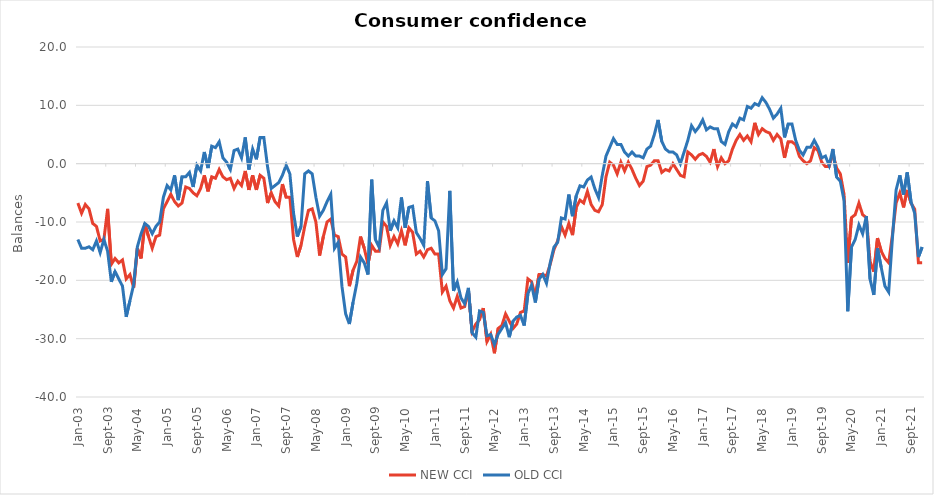
| Category | NEW CCI | OLD CCI |
|---|---|---|
| 2003-01-01 | -6.75 | -13 |
| 2003-02-01 | -8.5 | -14.5 |
| 2003-03-01 | -7 | -14.5 |
| 2003-04-01 | -7.75 | -14.25 |
| 2003-05-01 | -10.25 | -14.75 |
| 2003-06-01 | -10.75 | -13.25 |
| 2003-07-01 | -13.25 | -15.25 |
| 2003-08-01 | -13 | -13 |
| 2003-09-01 | -7.75 | -15 |
| 2003-10-01 | -17.25 | -20.25 |
| 2003-11-01 | -16.25 | -18.5 |
| 2003-12-01 | -17 | -19.75 |
| 2004-01-01 | -16.5 | -21 |
| 2004-02-01 | -19.75 | -26.25 |
| 2004-03-01 | -19 | -23.5 |
| 2004-04-01 | -21.25 | -20.75 |
| 2004-05-01 | -14.5 | -14.25 |
| 2004-06-01 | -16.25 | -12 |
| 2004-07-01 | -10.25 | -10.25 |
| 2004-08-01 | -12.5 | -10.75 |
| 2004-09-01 | -14.5 | -12 |
| 2004-10-01 | -12.5 | -10.75 |
| 2004-11-01 | -12.25 | -10 |
| 2004-12-01 | -7.75 | -5.75 |
| 2005-01-01 | -6.5 | -3.75 |
| 2005-02-01 | -5.25 | -4.5 |
| 2005-03-01 | -6.5 | -2 |
| 2005-04-01 | -7.25 | -6.25 |
| 2005-05-01 | -6.75 | -2.25 |
| 2005-06-01 | -4 | -2.25 |
| 2005-07-01 | -4.25 | -1.5 |
| 2005-08-01 | -5 | -4 |
| 2005-09-01 | -5.5 | -0.25 |
| 2005-10-01 | -4.25 | -1.25 |
| 2005-11-01 | -2 | 2 |
| 2005-12-01 | -4.75 | -0.75 |
| 2006-01-01 | -2.25 | 3 |
| 2006-02-01 | -2.5 | 2.75 |
| 2006-03-01 | -1 | 3.75 |
| 2006-04-01 | -2.25 | 1 |
| 2006-05-01 | -2.75 | 0.25 |
| 2006-06-01 | -2.5 | -1 |
| 2006-07-01 | -4.25 | 2.25 |
| 2006-08-01 | -3 | 2.5 |
| 2006-09-01 | -3.75 | 1 |
| 2006-10-01 | -1.25 | 4.5 |
| 2006-11-01 | -4.5 | -1 |
| 2006-12-01 | -2 | 2.5 |
| 2007-01-01 | -4.5 | 0.75 |
| 2007-02-01 | -2 | 4.5 |
| 2007-03-01 | -2.5 | 4.5 |
| 2007-04-01 | -6.75 | -0.5 |
| 2007-05-01 | -5 | -4.25 |
| 2007-06-01 | -6.5 | -3.75 |
| 2007-07-01 | -7.25 | -3.25 |
| 2007-08-01 | -3.5 | -2 |
| 2007-09-01 | -5.75 | -0.25 |
| 2007-10-01 | -5.75 | -1.75 |
| 2007-11-01 | -13 | -8.5 |
| 2007-12-01 | -16 | -12.5 |
| 2008-01-01 | -14 | -10.75 |
| 2008-02-01 | -10.75 | -1.75 |
| 2008-03-01 | -8 | -1.25 |
| 2008-04-01 | -7.75 | -1.75 |
| 2008-05-01 | -10 | -5.75 |
| 2008-06-01 | -15.75 | -9 |
| 2008-07-01 | -12.5 | -8 |
| 2008-08-01 | -10 | -6.5 |
| 2008-09-01 | -9.5 | -5.25 |
| 2008-10-01 | -12.25 | -14.5 |
| 2008-11-01 | -12.5 | -13.5 |
| 2008-12-01 | -15.5 | -21 |
| 2009-01-01 | -16 | -25.75 |
| 2009-02-01 | -21 | -27.5 |
| 2009-03-01 | -18.25 | -23.75 |
| 2009-04-01 | -16.75 | -20.5 |
| 2009-05-01 | -12.5 | -16 |
| 2009-06-01 | -14.5 | -17 |
| 2009-07-01 | -17.25 | -19 |
| 2009-08-01 | -14 | -2.75 |
| 2009-09-01 | -15 | -13 |
| 2009-10-01 | -15 | -14.3 |
| 2009-11-01 | -10 | -8 |
| 2009-12-01 | -10.75 | -6.7 |
| 2010-01-01 | -14 | -11.5 |
| 2010-02-01 | -12.5 | -9.8 |
| 2010-03-01 | -13.75 | -11 |
| 2010-04-01 | -11.5 | -5.8 |
| 2010-05-01 | -14 | -11 |
| 2010-06-01 | -11 | -7.5 |
| 2010-07-01 | -11.75 | -7.3 |
| 2010-08-01 | -15.5 | -11.8 |
| 2010-09-01 | -15 | -12.8 |
| 2010-10-01 | -16 | -14 |
| 2010-11-01 | -14.75 | -2.984 |
| 2010-12-01 | -14.5 | -9.3 |
| 2011-01-01 | -15.5 | -9.8 |
| 2011-02-01 | -15.5 | -11.5 |
| 2011-03-01 | -22 | -19 |
| 2011-04-01 | -21 | -18 |
| 2011-05-01 | -23.5 | -4.656 |
| 2011-06-01 | -24.75 | -21.8 |
| 2011-07-01 | -22.75 | -20.3 |
| 2011-08-01 | -24.75 | -23 |
| 2011-09-01 | -24.5 | -24 |
| 2011-10-01 | -21.75 | -21.3 |
| 2011-11-01 | -28.75 | -29 |
| 2011-12-01 | -27.5 | -29.75 |
| 2012-01-01 | -26.75 | -25.25 |
| 2012-02-01 | -24.75 | -25.5 |
| 2012-03-01 | -30.5 | -29.5 |
| 2012-04-01 | -29.25 | -29.3 |
| 2012-05-01 | -32.5 | -31 |
| 2012-06-01 | -28.25 | -29.25 |
| 2012-07-01 | -27.75 | -28.25 |
| 2012-08-01 | -25.75 | -27.25 |
| 2012-09-01 | -27 | -29.75 |
| 2012-10-01 | -28.25 | -27 |
| 2012-11-01 | -27.5 | -26.3 |
| 2012-12-01 | -25.5 | -26 |
| 2013-01-01 | -25.25 | -27.75 |
| 2013-02-01 | -19.75 | -22.3 |
| 2013-03-01 | -20.25 | -20.8 |
| 2013-04-01 | -22.75 | -23.8 |
| 2013-05-01 | -19 | -19.8 |
| 2013-06-01 | -19 | -19 |
| 2013-07-01 | -19.25 | -20.5 |
| 2013-08-01 | -17.25 | -17 |
| 2013-09-01 | -14.75 | -14.3 |
| 2013-10-01 | -13.25 | -13.5 |
| 2013-11-01 | -10.75 | -9.3 |
| 2013-12-01 | -12.25 | -9.5 |
| 2014-01-01 | -10.25 | -5.3 |
| 2014-02-01 | -12.25 | -9 |
| 2014-03-01 | -7.5 | -5.5 |
| 2014-04-01 | -6.25 | -3.8 |
| 2014-05-01 | -6.75 | -4 |
| 2014-06-01 | -4.75 | -2.8 |
| 2014-07-01 | -7 | -2.3 |
| 2014-08-01 | -8 | -4.3 |
| 2014-09-01 | -8.25 | -5.8 |
| 2014-10-01 | -7 | -2 |
| 2014-11-01 | -2.25 | 1.3 |
| 2014-12-01 | 0.25 | 2.8 |
| 2015-01-01 | -0.25 | 4.3 |
| 2015-02-01 | -1.75 | 3.3 |
| 2015-03-01 | 0.25 | 3.3 |
| 2015-04-01 | -1.25 | 2 |
| 2015-05-01 | 0.25 | 1.3 |
| 2015-06-01 | -1 | 2 |
| 2015-07-01 | -2.5 | 1.3 |
| 2015-08-01 | -3.75 | 1.3 |
| 2015-09-01 | -3 | 1 |
| 2015-10-01 | -0.5 | 2.5 |
| 2015-11-01 | -0.25 | 3 |
| 2015-12-01 | 0.5 | 5 |
| 2016-01-01 | 0.5 | 7.5 |
| 2016-02-01 | -1.5 | 3.8 |
| 2016-03-01 | -1 | 2.5 |
| 2016-04-01 | -1.25 | 2 |
| 2016-05-01 | 0 | 2 |
| 2016-06-01 | -1 | 1.5 |
| 2016-07-01 | -2 | 0 |
| 2016-08-01 | -2.25 | 2 |
| 2016-09-01 | 2 | 4 |
| 2016-10-01 | 1.5 | 6.5 |
| 2016-11-01 | 0.75 | 5.5 |
| 2016-12-01 | 1.5 | 6.3 |
| 2017-01-01 | 1.75 | 7.5 |
| 2017-02-01 | 1.25 | 5.8 |
| 2017-03-01 | 0.25 | 6.3 |
| 2017-04-01 | 2.5 | 6 |
| 2017-05-01 | -0.5 | 6 |
| 2017-06-01 | 1 | 3.8 |
| 2017-07-01 | 0 | 3.3 |
| 2017-08-01 | 0.5 | 5.5 |
| 2017-09-01 | 2.5 | 6.8 |
| 2017-10-01 | 4 | 6.3 |
| 2017-11-01 | 5 | 7.8 |
| 2017-12-01 | 4 | 7.5 |
| 2018-01-01 | 4.75 | 9.8 |
| 2018-02-01 | 3.75 | 9.5 |
| 2018-03-01 | 7 | 10.3 |
| 2018-04-01 | 5 | 10 |
| 2018-05-01 | 6 | 11.3 |
| 2018-06-01 | 5.5 | 10.5 |
| 2018-07-01 | 5.25 | 9.3 |
| 2018-08-01 | 4 | 7.8 |
| 2018-09-01 | 5 | 8.5 |
| 2018-10-01 | 4.25 | 9.5 |
| 2018-11-01 | 1 | 4.5 |
| 2018-12-01 | 3.75 | 6.8 |
| 2019-01-01 | 3.75 | 6.8 |
| 2019-02-01 | 3.25 | 4 |
| 2019-03-01 | 1.25 | 2.3 |
| 2019-04-01 | 0.5 | 1.5 |
| 2019-05-01 | 0 | 2.8 |
| 2019-06-01 | 0.5 | 2.8 |
| 2019-07-01 | 2.75 | 4 |
| 2019-08-01 | 2.25 | 2.8 |
| 2019-09-01 | 0.25 | 1 |
| 2019-10-01 | -0.5 | 1.3 |
| 2019-11-01 | -0.5 | -0.3 |
| 2019-12-01 | 1.75 | 2.5 |
| 2020-01-01 | -0.75 | -2.3 |
| 2020-02-01 | -1.75 | -3 |
| 2020-03-01 | -5.25 | -6.3 |
| 2020-04-01 | -17 | -25.3 |
| 2020-05-01 | -9.25 | -14.3 |
| 2020-06-01 | -8.75 | -13 |
| 2020-07-01 | -6.75 | -10.5 |
| 2020-08-01 | -8.75 | -12 |
| 2020-09-01 | -9.25 | -9 |
| 2020-10-01 | -16.75 | -19.8 |
| 2020-11-01 | -18.5 | -22.5 |
| 2020-12-01 | -12.75 | -14.5 |
| 2021-01-01 | -15 | -17.8 |
| 2021-02-01 | -16.25 | -21 |
| 2021-03-01 | -17 | -22 |
| 2021-04-01 | -12.25 | -12.8 |
| 2021-05-01 | -6.75 | -4.5 |
| 2021-06-01 | -5 | -2 |
| 2021-07-01 | -7.5 | -5.3 |
| 2021-08-01 | -4.5 | -1.5 |
| 2021-09-01 | -6.75 | -6.5 |
| 2021-10-01 | -7.8 | -8.5 |
| 2021-11-01 | -17 | -16 |
| 2021-12-01 | -17 | -14.3 |